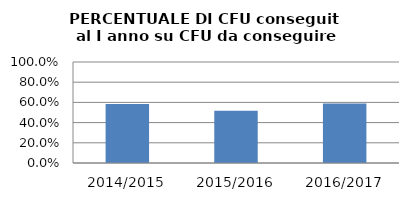
| Category | 2014/2015 2015/2016 2016/2017 |
|---|---|
| 2014/2015 | 0.583 |
| 2015/2016 | 0.518 |
| 2016/2017 | 0.588 |